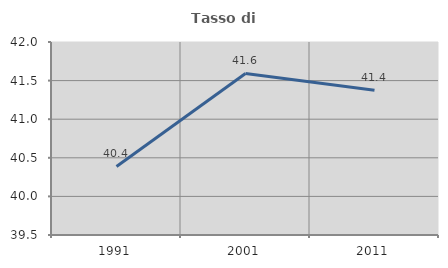
| Category | Tasso di occupazione   |
|---|---|
| 1991.0 | 40.388 |
| 2001.0 | 41.593 |
| 2011.0 | 41.375 |